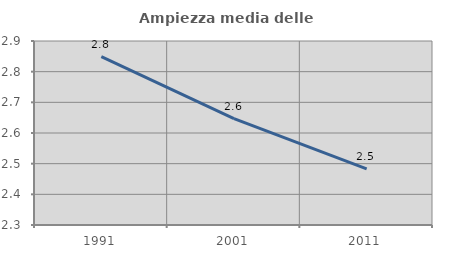
| Category | Ampiezza media delle famiglie |
|---|---|
| 1991.0 | 2.849 |
| 2001.0 | 2.647 |
| 2011.0 | 2.483 |